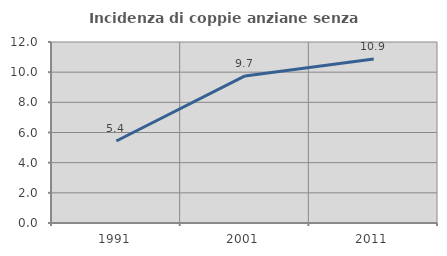
| Category | Incidenza di coppie anziane senza figli  |
|---|---|
| 1991.0 | 5.438 |
| 2001.0 | 9.749 |
| 2011.0 | 10.87 |